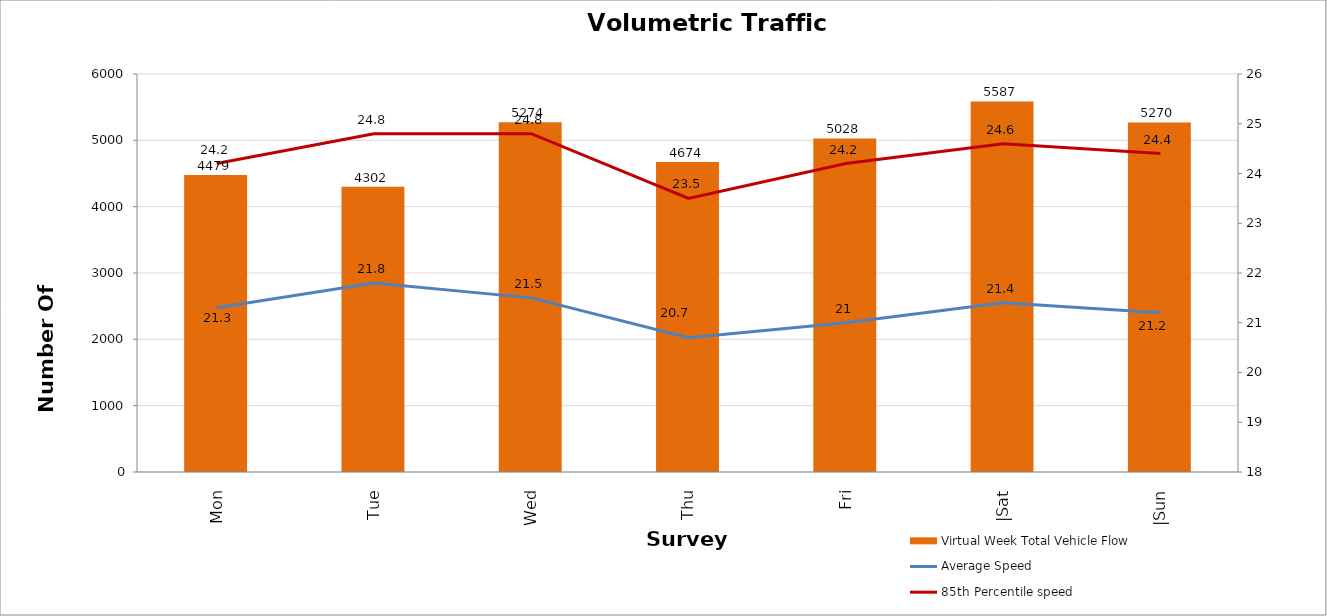
| Category | Virtual Week Total Vehicle Flow |
|---|---|
| Mon | 4479 |
| Tue | 4302 |
| Wed | 5274 |
| Thu | 4674 |
| Fri | 5028 |
| |Sat | 5587 |
| |Sun | 5270 |